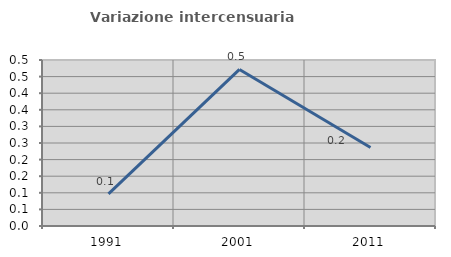
| Category | Variazione intercensuaria annua |
|---|---|
| 1991.0 | 0.097 |
| 2001.0 | 0.472 |
| 2011.0 | 0.236 |